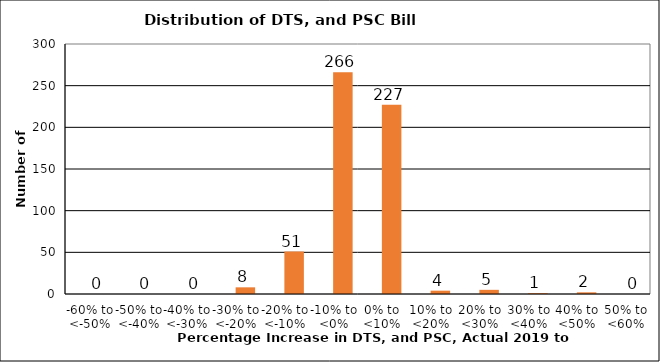
| Category | Series 0 | Series 1 |
|---|---|---|
| -60% to <-50% |  | 0 |
| -50% to <-40% |  | 0 |
| -40% to <-30% |  | 0 |
| -30% to <-20% |  | 8 |
| -20% to <-10% |  | 51 |
| -10% to <0% |  | 266 |
| 0% to <10% |  | 227 |
| 10% to <20% |  | 4 |
| 20% to <30% |  | 5 |
| 30% to <40% |  | 1 |
| 40% to <50% |  | 2 |
| 50% to <60% |  | 0 |